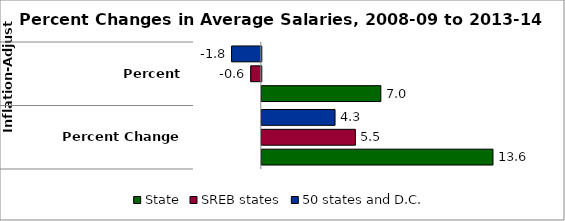
| Category | State | SREB states | 50 states and D.C. |
|---|---|---|---|
| 0 | 13.639 | 5.522 | 4.321 |
| 1 | 7.023 | -0.621 | -1.753 |